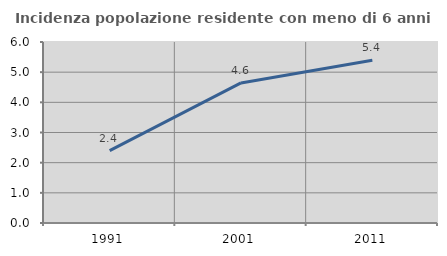
| Category | Incidenza popolazione residente con meno di 6 anni |
|---|---|
| 1991.0 | 2.397 |
| 2001.0 | 4.644 |
| 2011.0 | 5.395 |